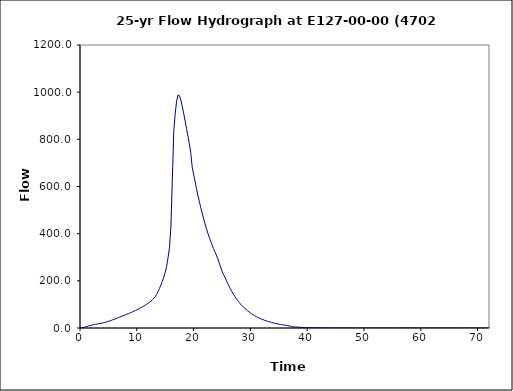
| Category | Series 0 |
|---|---|
| 0.0 | 0 |
| 0.25 | 0.3 |
| 0.5 | 1.3 |
| 0.75 | 3 |
| 1.0 | 4.9 |
| 1.25 | 6.8 |
| 1.5 | 8.5 |
| 1.75 | 10.1 |
| 2.0 | 11.6 |
| 2.25 | 13.1 |
| 2.5 | 14.4 |
| 2.75 | 15.7 |
| 3.0 | 17 |
| 3.25 | 18.1 |
| 3.5 | 19.2 |
| 3.75 | 20.3 |
| 4.0 | 21.5 |
| 4.25 | 22.9 |
| 4.5 | 24.5 |
| 4.75 | 26.3 |
| 5.0 | 28.3 |
| 5.25 | 30.4 |
| 5.5 | 32.5 |
| 5.75 | 34.7 |
| 6.0 | 37 |
| 6.25 | 39.3 |
| 6.5 | 41.7 |
| 6.75 | 44 |
| 7.0 | 46.4 |
| 7.25 | 48.8 |
| 7.5 | 51.2 |
| 7.75 | 53.5 |
| 8.0 | 55.9 |
| 8.25 | 58.3 |
| 8.5 | 60.7 |
| 8.75 | 63.2 |
| 9.0 | 65.8 |
| 9.25 | 68.4 |
| 9.5 | 71.3 |
| 9.75 | 74.2 |
| 10.0 | 77.3 |
| 10.25 | 80.4 |
| 10.5 | 83.5 |
| 10.75 | 86.6 |
| 11.0 | 89.8 |
| 11.25 | 93.2 |
| 11.5 | 96.9 |
| 11.75 | 100.8 |
| 12.0 | 105.1 |
| 12.25 | 109.7 |
| 12.5 | 114.6 |
| 12.75 | 120 |
| 13.0 | 125.9 |
| 13.25 | 133.2 |
| 13.5 | 142.8 |
| 13.75 | 154.7 |
| 14.0 | 168 |
| 14.25 | 182.3 |
| 14.5 | 197.9 |
| 14.75 | 215.6 |
| 15.0 | 236.2 |
| 15.25 | 261.4 |
| 15.5 | 298.7 |
| 15.75 | 340.9 |
| 16.0 | 428.7 |
| 16.25 | 623.2 |
| 16.5 | 831.8 |
| 16.75 | 906.4 |
| 17.0 | 960.3 |
| 17.25 | 987.7 |
| 17.5 | 985.2 |
| 17.75 | 966.3 |
| 18.0 | 940 |
| 18.25 | 910.2 |
| 18.5 | 878.6 |
| 18.75 | 846.2 |
| 19.0 | 813.9 |
| 19.25 | 781.3 |
| 19.5 | 743.3 |
| 19.75 | 682.5 |
| 20.0 | 651.8 |
| 20.25 | 622.1 |
| 20.5 | 591.4 |
| 20.75 | 564 |
| 21.0 | 537 |
| 21.25 | 511.9 |
| 21.5 | 487.8 |
| 21.75 | 463.8 |
| 22.0 | 441.7 |
| 22.25 | 421.9 |
| 22.5 | 402.9 |
| 22.75 | 385.1 |
| 23.0 | 368.3 |
| 23.25 | 352.4 |
| 23.5 | 337.2 |
| 23.75 | 322.9 |
| 24.0 | 309.3 |
| 24.25 | 294.6 |
| 24.5 | 277.2 |
| 24.75 | 258.7 |
| 25.0 | 241.2 |
| 25.25 | 227.2 |
| 25.5 | 216 |
| 25.75 | 202.3 |
| 26.0 | 188.8 |
| 26.25 | 176.3 |
| 26.5 | 164.7 |
| 26.75 | 153.9 |
| 27.0 | 143.7 |
| 27.25 | 134.3 |
| 27.5 | 125.4 |
| 27.75 | 117.1 |
| 28.0 | 109 |
| 28.25 | 101.8 |
| 28.5 | 95.2 |
| 28.75 | 89 |
| 29.0 | 83.2 |
| 29.25 | 77.8 |
| 29.5 | 72.8 |
| 29.75 | 68.1 |
| 30.0 | 63.7 |
| 30.25 | 59.6 |
| 30.5 | 55.7 |
| 30.75 | 52.2 |
| 31.0 | 48.8 |
| 31.25 | 45.6 |
| 31.5 | 42.7 |
| 31.75 | 40 |
| 32.0 | 37.4 |
| 32.25 | 35 |
| 32.5 | 32.7 |
| 32.75 | 30.6 |
| 33.0 | 28.6 |
| 33.25 | 26.7 |
| 33.5 | 25 |
| 33.75 | 23.3 |
| 34.0 | 21.8 |
| 34.25 | 20.3 |
| 34.5 | 19 |
| 34.75 | 17.7 |
| 35.0 | 16.5 |
| 35.25 | 15.3 |
| 35.5 | 14.2 |
| 35.75 | 13.2 |
| 36.0 | 12.2 |
| 36.25 | 11.3 |
| 36.5 | 10.3 |
| 36.75 | 9.3 |
| 37.0 | 7.9 |
| 37.25 | 6.3 |
| 37.5 | 5.1 |
| 37.75 | 4.5 |
| 38.0 | 4 |
| 38.25 | 3.6 |
| 38.5 | 3.2 |
| 38.75 | 2.9 |
| 39.0 | 2.6 |
| 39.25 | 2.3 |
| 39.5 | 2.1 |
| 39.75 | 1.8 |
| 40.0 | 1.6 |
| 40.25 | 1.5 |
| 40.5 | 1.3 |
| 40.75 | 1.2 |
| 41.0 | 1.1 |
| 41.25 | 0.9 |
| 41.5 | 0.8 |
| 41.75 | 0.7 |
| 42.0 | 0.6 |
| 42.25 | 0.6 |
| 42.5 | 0.5 |
| 42.75 | 0.4 |
| 43.0 | 0.4 |
| 43.25 | 0.3 |
| 43.5 | 0.2 |
| 43.75 | 0.2 |
| 44.0 | 0.2 |
| 44.25 | 0.1 |
| 44.5 | 0.1 |
| 44.75 | 0 |
| 45.0 | 0 |
| 45.25 | 0 |
| 45.5 | 0 |
| 45.75 | 0 |
| 46.0 | 0 |
| 46.25 | 0 |
| 46.5 | 0 |
| 46.75 | 0 |
| 47.0 | 0 |
| 47.25 | 0 |
| 47.5 | 0 |
| 47.75 | 0 |
| 48.0 | 0 |
| 48.25 | 0 |
| 48.5 | 0 |
| 48.75 | 0 |
| 49.0 | 0 |
| 49.25 | 0 |
| 49.5 | 0 |
| 49.75 | 0 |
| 50.0 | 0 |
| 50.25 | 0 |
| 50.5 | 0 |
| 50.75 | 0 |
| 51.0 | 0 |
| 51.25 | 0 |
| 51.5 | 0 |
| 51.75 | 0 |
| 52.0 | 0 |
| 52.25 | 0 |
| 52.5 | 0 |
| 52.75 | 0 |
| 53.0 | 0 |
| 53.25 | 0 |
| 53.5 | 0 |
| 53.75 | 0 |
| 54.0 | 0 |
| 54.25 | 0 |
| 54.5 | 0 |
| 54.75 | 0 |
| 55.0 | 0 |
| 55.25 | 0 |
| 55.5 | 0 |
| 55.75 | 0 |
| 56.0 | 0 |
| 56.25 | 0 |
| 56.5 | 0 |
| 56.75 | 0 |
| 57.0 | 0 |
| 57.25 | 0 |
| 57.5 | 0 |
| 57.75 | 0 |
| 58.0 | 0 |
| 58.25 | 0 |
| 58.5 | 0 |
| 58.75 | 0 |
| 59.0 | 0 |
| 59.25 | 0 |
| 59.5 | 0 |
| 59.75 | 0 |
| 60.0 | 0 |
| 60.25 | 0 |
| 60.5 | 0 |
| 60.75 | 0 |
| 61.0 | 0 |
| 61.25 | 0 |
| 61.5 | 0 |
| 61.75 | 0 |
| 62.0 | 0 |
| 62.25 | 0 |
| 62.5 | 0 |
| 62.75 | 0 |
| 63.0 | 0 |
| 63.25 | 0 |
| 63.5 | 0 |
| 63.75 | 0 |
| 64.0 | 0 |
| 64.25 | 0 |
| 64.5 | 0 |
| 64.75 | 0 |
| 65.0 | 0 |
| 65.25 | 0 |
| 65.5 | 0 |
| 65.75 | 0 |
| 66.0 | 0 |
| 66.25 | 0 |
| 66.5 | 0 |
| 66.75 | 0 |
| 67.0 | 0 |
| 67.25 | 0 |
| 67.5 | 0 |
| 67.75 | 0 |
| 68.0 | 0 |
| 68.25 | 0 |
| 68.5 | 0 |
| 68.75 | 0 |
| 69.0 | 0 |
| 69.25 | 0 |
| 69.5 | 0 |
| 69.75 | 0 |
| 70.0 | 0 |
| 70.25 | 0 |
| 70.5 | 0 |
| 70.75 | 0 |
| 71.0 | 0 |
| 71.25 | 0 |
| 71.5 | 0 |
| 71.75 | 0 |
| 72.0 | 0 |
| 72.25 | 0 |
| 72.5 | 0 |
| 72.75 | 0 |
| 73.0 | 0 |
| 73.25 | 0 |
| 73.5 | 0 |
| 73.75 | 0 |
| 74.0 | 0 |
| 74.25 | 0 |
| 74.5 | 0 |
| 74.75 | 0 |
| 75.0 | 0 |
| 75.25 | 0 |
| 75.5 | 0 |
| 75.75 | 0 |
| 76.0 | 0 |
| 76.25 | 0 |
| 76.5 | 0 |
| 76.75 | 0 |
| 77.0 | 0 |
| 77.25 | 0 |
| 77.5 | 0 |
| 77.75 | 0 |
| 78.0 | 0 |
| 78.25 | 0 |
| 78.5 | 0 |
| 78.75 | 0 |
| 79.0 | 0 |
| 79.25 | 0 |
| 79.5 | 0 |
| 79.75 | 0 |
| 80.0 | 0 |
| 80.25 | 0 |
| 80.5 | 0 |
| 80.75 | 0 |
| 81.0 | 0 |
| 81.25 | 0 |
| 81.5 | 0 |
| 81.75 | 0 |
| 82.0 | 0 |
| 82.25 | 0 |
| 82.5 | 0 |
| 82.75 | 0 |
| 83.0 | 0 |
| 83.25 | 0 |
| 83.5 | 0 |
| 83.75 | 0 |
| 84.0 | 0 |
| 84.25 | 0 |
| 84.5 | 0 |
| 84.75 | 0 |
| 85.0 | 0 |
| 85.25 | 0 |
| 85.5 | 0 |
| 85.75 | 0 |
| 86.0 | 0 |
| 86.25 | 0 |
| 86.5 | 0 |
| 86.75 | 0 |
| 87.0 | 0 |
| 87.25 | 0 |
| 87.5 | 0 |
| 87.75 | 0 |
| 88.0 | 0 |
| 88.25 | 0 |
| 88.5 | 0 |
| 88.75 | 0 |
| 89.0 | 0 |
| 89.25 | 0 |
| 89.5 | 0 |
| 89.75 | 0 |
| 90.0 | 0 |
| 90.25 | 0 |
| 90.5 | 0 |
| 90.75 | 0 |
| 91.0 | 0 |
| 91.25 | 0 |
| 91.5 | 0 |
| 91.75 | 0 |
| 92.0 | 0 |
| 92.25 | 0 |
| 92.5 | 0 |
| 92.75 | 0 |
| 93.0 | 0 |
| 93.25 | 0 |
| 93.5 | 0 |
| 93.75 | 0 |
| 94.0 | 0 |
| 94.25 | 0 |
| 94.5 | 0 |
| 94.75 | 0 |
| 95.0 | 0 |
| 95.25 | 0 |
| 95.5 | 0 |
| 95.75 | 0 |
| 96.0 | 0 |
| 96.25 | 0 |
| 96.5 | 0 |
| 96.75 | 0 |
| 97.0 | 0 |
| 97.25 | 0 |
| 97.5 | 0 |
| 97.75 | 0 |
| 98.0 | 0 |
| 98.25 | 0 |
| 98.5 | 0 |
| 98.75 | 0 |
| 99.0 | 0 |
| 99.25 | 0 |
| 99.5 | 0 |
| 99.75 | 0 |
| 100.0 | 0 |
| 100.25 | 0 |
| 100.5 | 0 |
| 100.75 | 0 |
| 101.0 | 0 |
| 101.25 | 0 |
| 101.5 | 0 |
| 101.75 | 0 |
| 102.0 | 0 |
| 102.25 | 0 |
| 102.5 | 0 |
| 102.75 | 0 |
| 103.0 | 0 |
| 103.25 | 0 |
| 103.5 | 0 |
| 103.75 | 0 |
| 104.0 | 0 |
| 104.25 | 0 |
| 104.5 | 0 |
| 104.75 | 0 |
| 105.0 | 0 |
| 105.25 | 0 |
| 105.5 | 0 |
| 105.75 | 0 |
| 106.0 | 0 |
| 106.25 | 0 |
| 106.5 | 0 |
| 106.75 | 0 |
| 107.0 | 0 |
| 107.25 | 0 |
| 107.5 | 0 |
| 107.75 | 0 |
| 108.0 | 0 |
| 108.25 | 0 |
| 108.5 | 0 |
| 108.75 | 0 |
| 109.0 | 0 |
| 109.25 | 0 |
| 109.5 | 0 |
| 109.75 | 0 |
| 110.0 | 0 |
| 110.25 | 0 |
| 110.5 | 0 |
| 110.75 | 0 |
| 111.0 | 0 |
| 111.25 | 0 |
| 111.5 | 0 |
| 111.75 | 0 |
| 112.0 | 0 |
| 112.25 | 0 |
| 112.5 | 0 |
| 112.75 | 0 |
| 113.0 | 0 |
| 113.25 | 0 |
| 113.5 | 0 |
| 113.75 | 0 |
| 114.0 | 0 |
| 114.25 | 0 |
| 114.5 | 0 |
| 114.75 | 0 |
| 115.0 | 0 |
| 115.25 | 0 |
| 115.5 | 0 |
| 115.75 | 0 |
| 116.0 | 0 |
| 116.25 | 0 |
| 116.5 | 0 |
| 116.75 | 0 |
| 117.0 | 0 |
| 117.25 | 0 |
| 117.5 | 0 |
| 117.75 | 0 |
| 118.0 | 0 |
| 118.25 | 0 |
| 118.5 | 0 |
| 118.75 | 0 |
| 119.0 | 0 |
| 119.25 | 0 |
| 119.5 | 0 |
| 119.75 | 0 |
| 120.0 | 0 |
| 120.25 | 0 |
| 120.5 | 0 |
| 120.75 | 0 |
| 121.0 | 0 |
| 121.25 | 0 |
| 121.5 | 0 |
| 121.75 | 0 |
| 122.0 | 0 |
| 122.25 | 0 |
| 122.5 | 0 |
| 122.75 | 0 |
| 123.0 | 0 |
| 123.25 | 0 |
| 123.5 | 0 |
| 123.75 | 0 |
| 124.0 | 0 |
| 124.25 | 0 |
| 124.5 | 0 |
| 124.75 | 0 |
| 125.0 | 0 |
| 125.25 | 0 |
| 125.5 | 0 |
| 125.75 | 0 |
| 126.0 | 0 |
| 126.25 | 0 |
| 126.5 | 0 |
| 126.75 | 0 |
| 127.0 | 0 |
| 127.25 | 0 |
| 127.5 | 0 |
| 127.75 | 0 |
| 128.0 | 0 |
| 128.25 | 0 |
| 128.5 | 0 |
| 128.75 | 0 |
| 129.0 | 0 |
| 129.25 | 0 |
| 129.5 | 0 |
| 129.75 | 0 |
| 130.0 | 0 |
| 130.25 | 0 |
| 130.5 | 0 |
| 130.75 | 0 |
| 131.0 | 0 |
| 131.25 | 0 |
| 131.5 | 0 |
| 131.75 | 0 |
| 132.0 | 0 |
| 132.25 | 0 |
| 132.5 | 0 |
| 132.75 | 0 |
| 133.0 | 0 |
| 133.25 | 0 |
| 133.5 | 0 |
| 133.75 | 0 |
| 134.0 | 0 |
| 134.25 | 0 |
| 134.5 | 0 |
| 134.75 | 0 |
| 135.0 | 0 |
| 135.25 | 0 |
| 135.5 | 0 |
| 135.75 | 0 |
| 136.0 | 0 |
| 136.25 | 0 |
| 136.5 | 0 |
| 136.75 | 0 |
| 137.0 | 0 |
| 137.25 | 0 |
| 137.5 | 0 |
| 137.75 | 0 |
| 138.0 | 0 |
| 138.25 | 0 |
| 138.5 | 0 |
| 138.75 | 0 |
| 139.0 | 0 |
| 139.25 | 0 |
| 139.5 | 0 |
| 139.75 | 0 |
| 140.0 | 0 |
| 140.25 | 0 |
| 140.5 | 0 |
| 140.75 | 0 |
| 141.0 | 0 |
| 141.25 | 0 |
| 141.5 | 0 |
| 141.75 | 0 |
| 142.0 | 0 |
| 142.25 | 0 |
| 142.5 | 0 |
| 142.75 | 0 |
| 143.0 | 0 |
| 143.25 | 0 |
| 143.5 | 0 |
| 143.75 | 0 |
| 144.0 | 0 |
| 144.25 | 0 |
| 144.5 | 0 |
| 144.75 | 0 |
| 145.0 | 0 |
| 145.25 | 0 |
| 145.5 | 0 |
| 145.75 | 0 |
| 146.0 | 0 |
| 146.25 | 0 |
| 146.5 | 0 |
| 146.75 | 0 |
| 147.0 | 0 |
| 147.25 | 0 |
| 147.5 | 0 |
| 147.75 | 0 |
| 148.0 | 0 |
| 148.25 | 0 |
| 148.5 | 0 |
| 148.75 | 0 |
| 149.0 | 0 |
| 149.25 | 0 |
| 149.5 | 0 |
| 149.75 | 0 |
| 150.0 | 0 |
| 150.25 | 0 |
| 150.5 | 0 |
| 150.75 | 0 |
| 151.0 | 0 |
| 151.25 | 0 |
| 151.5 | 0 |
| 151.75 | 0 |
| 152.0 | 0 |
| 152.25 | 0 |
| 152.5 | 0 |
| 152.75 | 0 |
| 153.0 | 0 |
| 153.25 | 0 |
| 153.5 | 0 |
| 153.75 | 0 |
| 154.0 | 0 |
| 154.25 | 0 |
| 154.5 | 0 |
| 154.75 | 0 |
| 155.0 | 0 |
| 155.25 | 0 |
| 155.5 | 0 |
| 155.75 | 0 |
| 156.0 | 0 |
| 156.25 | 0 |
| 156.5 | 0 |
| 156.75 | 0 |
| 157.0 | 0 |
| 157.25 | 0 |
| 157.5 | 0 |
| 157.75 | 0 |
| 158.0 | 0 |
| 158.25 | 0 |
| 158.5 | 0 |
| 158.75 | 0 |
| 159.0 | 0 |
| 159.25 | 0 |
| 159.5 | 0 |
| 159.75 | 0 |
| 160.0 | 0 |
| 160.25 | 0 |
| 160.5 | 0 |
| 160.75 | 0 |
| 161.0 | 0 |
| 161.25 | 0 |
| 161.5 | 0 |
| 161.75 | 0 |
| 162.0 | 0 |
| 162.25 | 0 |
| 162.5 | 0 |
| 162.75 | 0 |
| 163.0 | 0 |
| 163.25 | 0 |
| 163.5 | 0 |
| 163.75 | 0 |
| 164.0 | 0 |
| 164.25 | 0 |
| 164.5 | 0 |
| 164.75 | 0 |
| 165.0 | 0 |
| 165.25 | 0 |
| 165.5 | 0 |
| 165.75 | 0 |
| 166.0 | 0 |
| 166.25 | 0 |
| 166.5 | 0 |
| 166.75 | 0 |
| 167.0 | 0 |
| 167.25 | 0 |
| 167.5 | 0 |
| 167.75 | 0 |
| 168.0 | 0 |
| 168.25 | 0 |
| 168.5 | 0 |
| 168.75 | 0 |
| 169.0 | 0 |
| 169.25 | 0 |
| 169.5 | 0 |
| 169.75 | 0 |
| 170.0 | 0 |
| 170.25 | 0 |
| 170.5 | 0 |
| 170.75 | 0 |
| 171.0 | 0 |
| 171.25 | 0 |
| 171.5 | 0 |
| 171.75 | 0 |
| 172.0 | 0 |
| 172.25 | 0 |
| 172.5 | 0 |
| 172.75 | 0 |
| 173.0 | 0 |
| 173.25 | 0 |
| 173.5 | 0 |
| 173.75 | 0 |
| 174.0 | 0 |
| 174.25 | 0 |
| 174.5 | 0 |
| 174.75 | 0 |
| 175.0 | 0 |
| 175.25 | 0 |
| 175.5 | 0 |
| 175.75 | 0 |
| 176.0 | 0 |
| 176.25 | 0 |
| 176.5 | 0 |
| 176.75 | 0 |
| 177.0 | 0 |
| 177.25 | 0 |
| 177.5 | 0 |
| 177.75 | 0 |
| 178.0 | 0 |
| 178.25 | 0 |
| 178.5 | 0 |
| 178.75 | 0 |
| 179.0 | 0 |
| 179.25 | 0 |
| 179.5 | 0 |
| 179.75 | 0 |
| 180.0 | 0 |
| 180.25 | 0 |
| 180.5 | 0 |
| 180.75 | 0 |
| 181.0 | 0 |
| 181.25 | 0 |
| 181.5 | 0 |
| 181.75 | 0 |
| 182.0 | 0 |
| 182.25 | 0 |
| 182.5 | 0 |
| 182.75 | 0 |
| 183.0 | 0 |
| 183.25 | 0 |
| 183.5 | 0 |
| 183.75 | 0 |
| 184.0 | 0 |
| 184.25 | 0 |
| 184.5 | 0 |
| 184.75 | 0 |
| 185.0 | 0 |
| 185.25 | 0 |
| 185.5 | 0 |
| 185.75 | 0 |
| 186.0 | 0 |
| 186.25 | 0 |
| 186.5 | 0 |
| 186.75 | 0 |
| 187.0 | 0 |
| 187.25 | 0 |
| 187.5 | 0 |
| 187.75 | 0 |
| 188.0 | 0 |
| 188.25 | 0 |
| 188.5 | 0 |
| 188.75 | 0 |
| 189.0 | 0 |
| 189.25 | 0 |
| 189.5 | 0 |
| 189.75 | 0 |
| 190.0 | 0 |
| 190.25 | 0 |
| 190.5 | 0 |
| 190.75 | 0 |
| 191.0 | 0 |
| 191.25 | 0 |
| 191.5 | 0 |
| 191.75 | 0 |